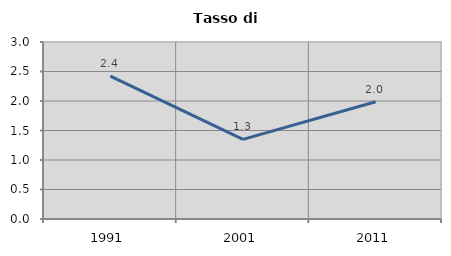
| Category | Tasso di disoccupazione   |
|---|---|
| 1991.0 | 2.422 |
| 2001.0 | 1.349 |
| 2011.0 | 1.988 |